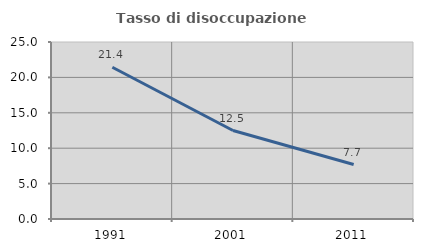
| Category | Tasso di disoccupazione giovanile  |
|---|---|
| 1991.0 | 21.429 |
| 2001.0 | 12.5 |
| 2011.0 | 7.692 |